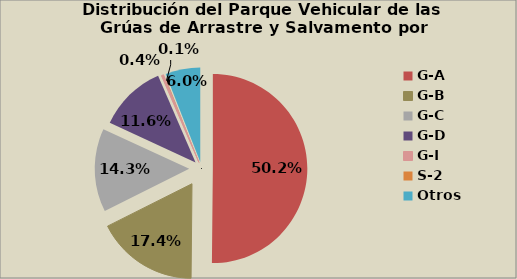
| Category | Series 0 |
|---|---|
| G-A | 50.156 |
| G-B | 17.437 |
| G-C | 14.284 |
| G-D | 11.631 |
| G-I | 0.374 |
| S-2 | 0.125 |
| S-3 | 0.027 |
| Otros | 5.967 |